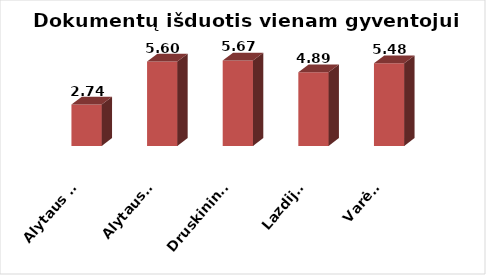
| Category | Series 0 |
|---|---|
| Alytaus m. | 2.744 |
| Alytaus r. | 5.595 |
| Druskininkai | 5.669 |
| Lazdijai | 4.889 |
| Varėna | 5.477 |